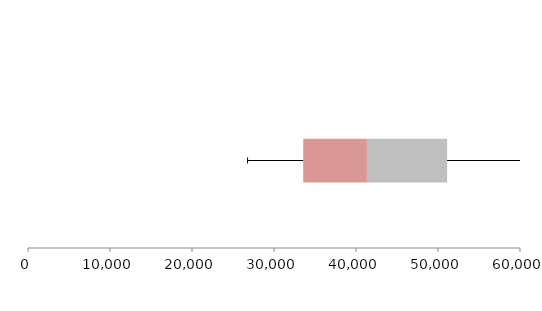
| Category | Series 1 | Series 2 | Series 3 |
|---|---|---|---|
| 0 | 33562.18 | 7769.488 | 9781.627 |